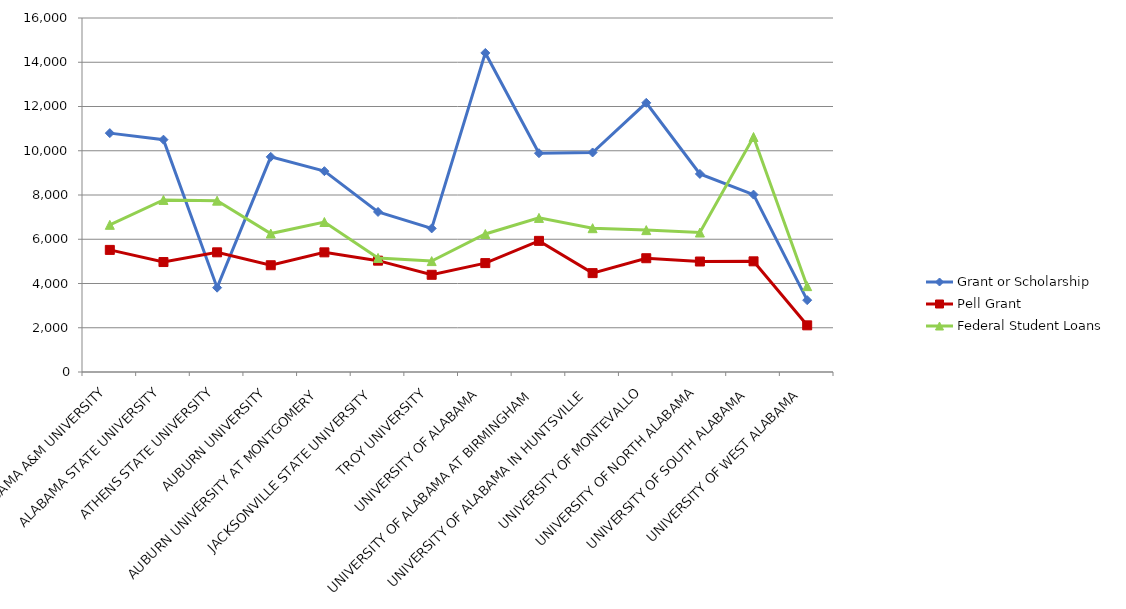
| Category | Grant or Scholarship | Pell Grant | Federal Student Loans |
|---|---|---|---|
| ALABAMA A&M UNIVERSITY | 10797 | 5519 | 6652 |
| ALABAMA STATE UNIVERSITY | 10501 | 4970 | 7777 |
| ATHENS STATE UNIVERSITY | 3811 | 5409 | 7745 |
| AUBURN UNIVERSITY | 9724 | 4825 | 6257 |
| AUBURN UNIVERSITY AT MONTGOMERY | 9078 | 5408 | 6779 |
| JACKSONVILLE STATE UNIVERSITY | 7234 | 5032 | 5156 |
| TROY UNIVERSITY | 6490 | 4394 | 5013 |
| UNIVERSITY OF ALABAMA | 14421 | 4922 | 6237 |
| UNIVERSITY OF ALABAMA AT BIRMINGHAM | 9889 | 5927 | 6966 |
| UNIVERSITY OF ALABAMA IN HUNTSVILLE | 9922 | 4469 | 6500 |
| UNIVERSITY OF MONTEVALLO | 12167 | 5142 | 6413 |
| UNIVERSITY OF NORTH ALABAMA | 8953 | 4993 | 6303 |
| UNIVERSITY OF SOUTH ALABAMA | 8018 | 5002 | 10621 |
| UNIVERSITY OF WEST ALABAMA | 3247 | 2109 | 3881 |